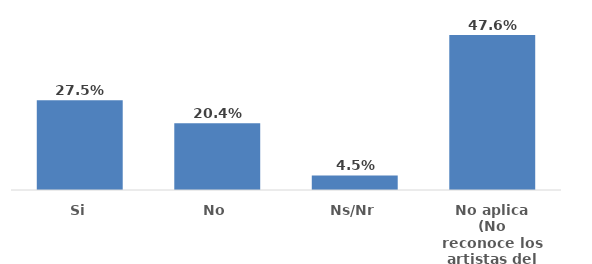
| Category | Series 0 |
|---|---|
| Si | 0.275 |
| No | 0.204 |
| Ns/Nr | 0.045 |
| No aplica (No reconoce los artistas del festival) | 0.476 |